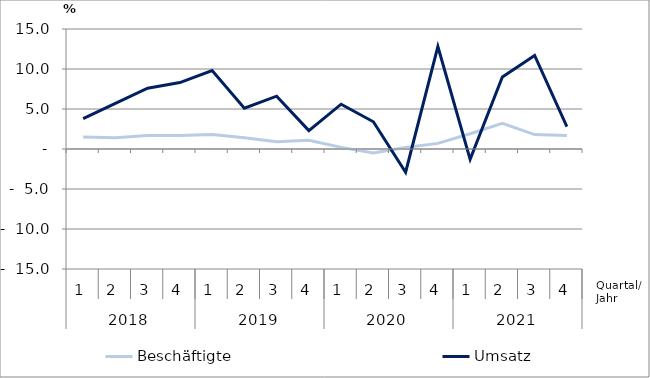
| Category | Beschäftigte | Umsatz |
|---|---|---|
| 0 | 1.5 | 3.8 |
| 1 | 1.4 | 5.7 |
| 2 | 1.7 | 7.6 |
| 3 | 1.7 | 8.3 |
| 4 | 1.8 | 9.8 |
| 5 | 1.4 | 5.1 |
| 6 | 0.9 | 6.6 |
| 7 | 1.1 | 2.3 |
| 8 | 0.2 | 5.6 |
| 9 | -0.5 | 3.4 |
| 10 | 0.2 | -2.9 |
| 11 | 0.7 | 12.8 |
| 12 | 1.9 | -1.3 |
| 13 | 3.2 | 9 |
| 14 | 1.8 | 11.7 |
| 15 | 1.7 | 2.8 |